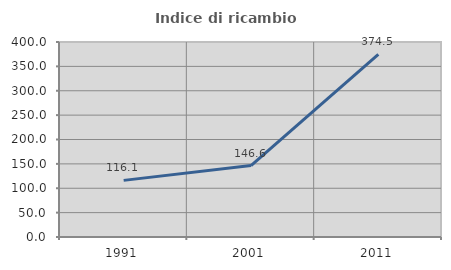
| Category | Indice di ricambio occupazionale  |
|---|---|
| 1991.0 | 116.143 |
| 2001.0 | 146.584 |
| 2011.0 | 374.49 |